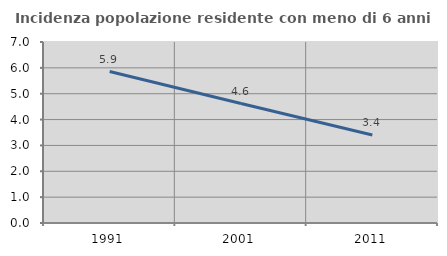
| Category | Incidenza popolazione residente con meno di 6 anni |
|---|---|
| 1991.0 | 5.859 |
| 2001.0 | 4.621 |
| 2011.0 | 3.401 |